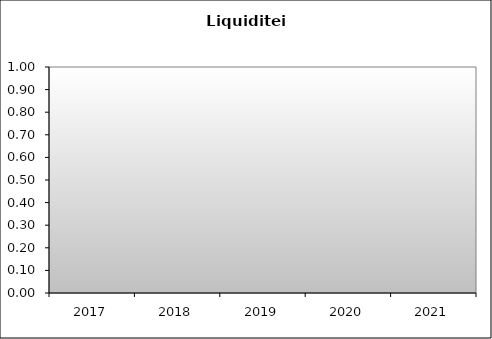
| Category | Series 0 |
|---|---|
| 2017.0 | 0 |
| 2018.0 | 0 |
| 2019.0 | 0 |
| 2020.0 | 0 |
| 2021.0 | 0 |